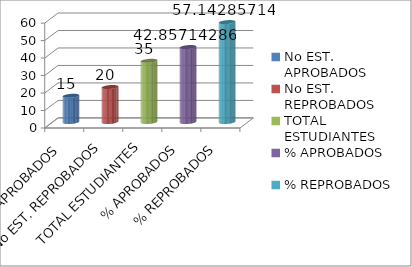
| Category | Series 0 |
|---|---|
| No EST. APROBADOS | 15 |
| No EST. REPROBADOS | 20 |
| TOTAL ESTUDIANTES | 35 |
| % APROBADOS | 42.857 |
| % REPROBADOS | 57.143 |